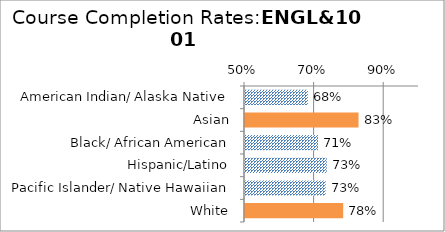
| Category | ENGL&101 |
|---|---|
| American Indian/ Alaska Native | 0.681 |
| Asian | 0.826 |
| Black/ African American | 0.71 |
| Hispanic/Latino | 0.735 |
| Pacific Islander/ Native Hawaiian | 0.732 |
| White | 0.782 |